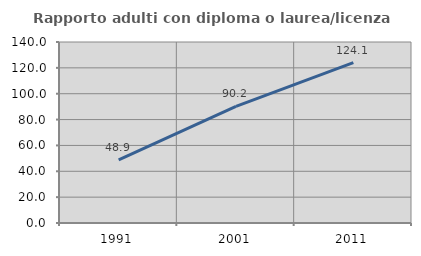
| Category | Rapporto adulti con diploma o laurea/licenza media  |
|---|---|
| 1991.0 | 48.857 |
| 2001.0 | 90.187 |
| 2011.0 | 124.115 |